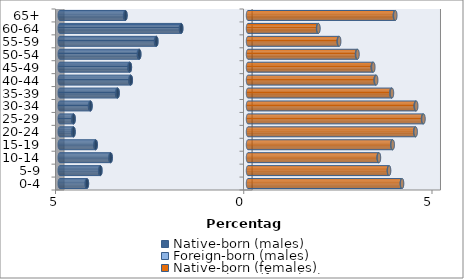
| Category | Native-born (males) | Foreign-born (males) | Native-born (females) | Foreign-born (females) |
|---|---|---|---|---|
| 0-4 | -4.278 | -0.007 | 4.087 | 0.007 |
| 5-9 | -3.92 | -0.008 | 3.742 | 0.007 |
| 10-14 | -3.647 | -0.009 | 3.471 | 0.008 |
| 15-19 | -4.045 | -0.011 | 3.834 | 0.01 |
| 20-24 | -4.634 | -0.012 | 4.443 | 0.011 |
| 25-29 | -4.632 | -0.014 | 4.649 | 0.013 |
| 30-34 | -4.183 | -0.015 | 4.456 | 0.014 |
| 35-39 | -3.463 | -0.016 | 3.81 | 0.015 |
| 40-44 | -3.112 | -0.016 | 3.391 | 0.016 |
| 45-49 | -3.137 | -0.015 | 3.315 | 0.015 |
| 50-54 | -2.888 | -0.014 | 2.896 | 0.014 |
| 55-59 | -2.434 | -0.012 | 2.411 | 0.012 |
| 60-64 | -1.774 | -0.01 | 1.861 | 0.011 |
| 65+ | -3.255 | -0.011 | 3.901 | 0.012 |